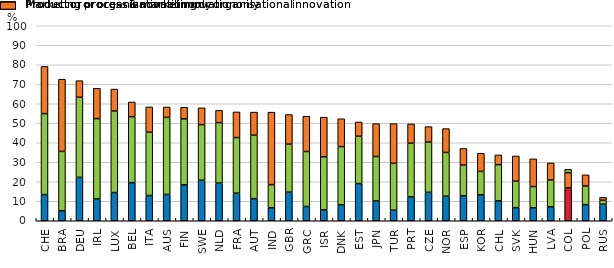
| Category | Product or process innovation only | Product or process & marketing or organisational innovation | Marketing or organisational innovation only |
|---|---|---|---|
| CHE | 13.426 | 41.503 | 24.209 |
| BRA | 5.158 | 30.398 | 37.044 |
| DEU | 22.258 | 41.087 | 8.493 |
| IRL | 11.175 | 41.213 | 15.568 |
| LUX | 14.469 | 41.801 | 11.254 |
| BEL | 19.559 | 33.822 | 7.502 |
| ITA | 12.927 | 32.452 | 13.016 |
| AUS | 13.479 | 39.535 | 5.334 |
| FIN | 18.438 | 33.827 | 5.956 |
| SWE | 20.768 | 28.528 | 8.622 |
| NLD | 19.322 | 31.009 | 6.285 |
| FRA | 14.149 | 28.513 | 13.16 |
| AUT | 11.342 | 32.545 | 11.83 |
| IND | 6.664 | 11.854 | 37.169 |
| GBR | 14.649 | 24.615 | 15.205 |
| GRC | 7.324 | 28.186 | 18.085 |
| ISR | 5.547 | 27.278 | 20.307 |
| DNK | 8.136 | 29.893 | 14.277 |
| EST | 19.074 | 24.265 | 7.317 |
| JPN | 10.152 | 22.799 | 16.864 |
| TUR | 5.395 | 24.067 | 20.348 |
| PRT | 12.225 | 27.539 | 9.876 |
| CZE | 14.578 | 25.779 | 7.91 |
| NOR | 12.606 | 22.41 | 12.248 |
| ESP | 12.853 | 15.655 | 8.553 |
| KOR | 13.349 | 11.965 | 9.286 |
| CHL | 10.198 | 18.59 | 4.981 |
| SVK | 6.728 | 13.546 | 12.95 |
| HUN | 6.625 | 10.929 | 14.2 |
| LVA | 7.127 | 13.769 | 8.747 |
| COL | 16.822 | 7.847 | 1.707 |
| POL | 8.256 | 9.552 | 5.749 |
| RUS | 8.454 | 2.012 | 1.505 |